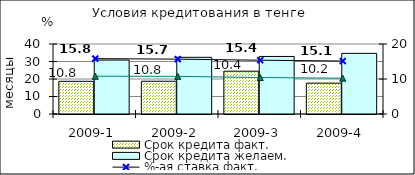
| Category | Срок кредита факт.  | Срок кредита желаем. |
|---|---|---|
| 2009-1 | 18.68 | 30.83 |
| 2009-2 | 18.72 | 32.39 |
| 2009-3 | 24.46 | 32.88 |
| 2009-4 | 17.63 | 34.65 |